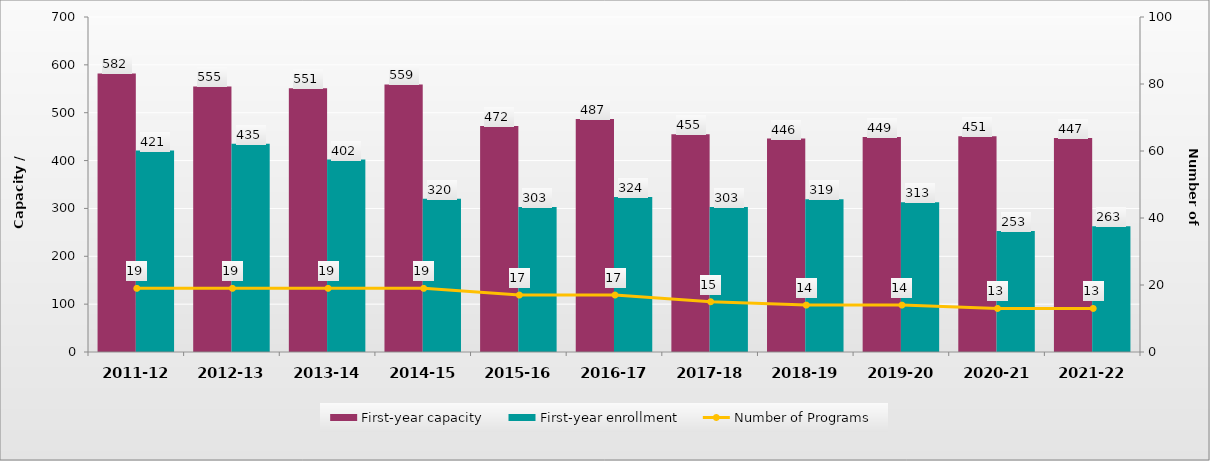
| Category | First-year capacity | First-year enrollment |
|---|---|---|
| 2011-12 | 582 | 421 |
| 2012-13 | 555 | 435 |
| 2013-14 | 551 | 402 |
| 2014-15 | 559 | 320 |
| 2015-16 | 472 | 303 |
| 2016-17 | 487 | 324 |
| 2017-18 | 455 | 303 |
| 2018-19 | 446 | 319 |
| 2019-20 | 449 | 313 |
| 2020-21 | 451 | 253 |
| 2021-22 | 447 | 263 |